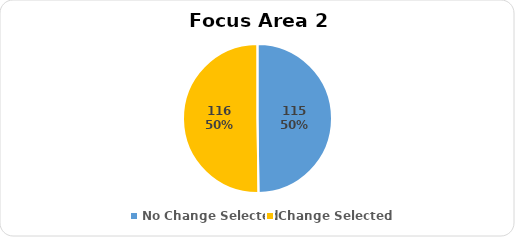
| Category | Series 0 |
|---|---|
| No Change Selected | 115 |
| Change Selected | 116 |